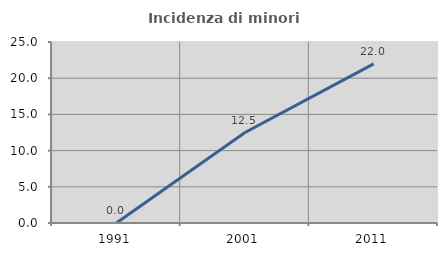
| Category | Incidenza di minori stranieri |
|---|---|
| 1991.0 | 0 |
| 2001.0 | 12.5 |
| 2011.0 | 21.978 |